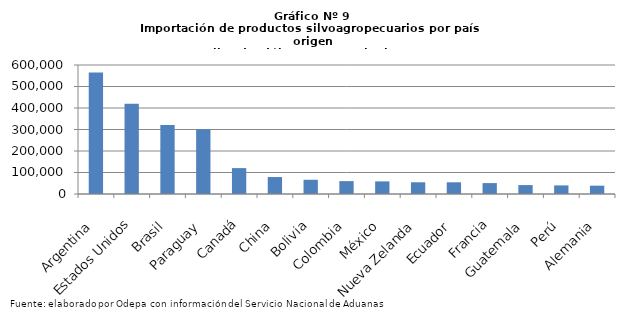
| Category | Series 0 |
|---|---|
| Argentina | 565394.646 |
| Estados Unidos | 419526.616 |
| Brasil | 321257.616 |
| Paraguay | 300743.53 |
| Canadá | 120423.376 |
| China | 78805.115 |
| Bolivia | 66101.701 |
| Colombia | 59939.001 |
| México | 58707.226 |
| Nueva Zelanda | 54476.273 |
| Ecuador | 54435.703 |
| Francia | 50708.78 |
| Guatemala | 41500.862 |
| Perú | 40035.812 |
| Alemania | 38710.329 |